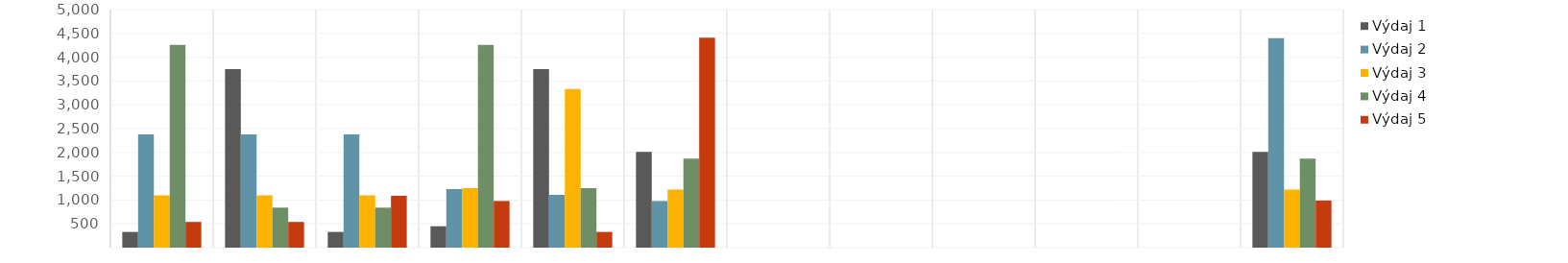
| Category | Výdaj 1 | Výdaj 2 | Výdaj 3 | Výdaj 4 | Výdaj 5 |
|---|---|---|---|---|---|
| Leden | 330 | 2380 | 1100 | 4260 | 540 |
| Únor | 3750 | 2380 | 1100 | 840 | 540 |
| Březen | 330 | 2380 | 1100 | 840 | 1090 |
| Duben | 450 | 1230 | 1250 | 4260 | 980 |
| Květen | 3750 | 1110 | 3330 | 1250 | 330 |
| Červen | 2010 | 980 | 1220 | 1870 | 4410 |
| Červenec | 0 | 0 | 0 | 0 | 0 |
| Srpen | 0 | 0 | 0 | 0 | 0 |
| Září | 0 | 0 | 0 | 0 | 0 |
| Říjen | 0 | 0 | 0 | 0 | 0 |
| Listopad | 0 | 0 | 0 | 0 | 0 |
| Prosinec | 2010 | 4400 | 1220 | 1870 | 990 |